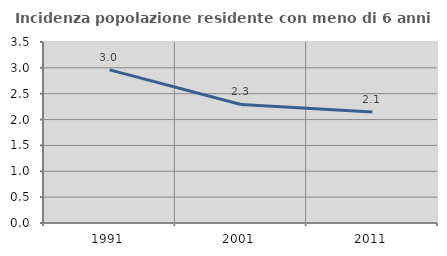
| Category | Incidenza popolazione residente con meno di 6 anni |
|---|---|
| 1991.0 | 2.96 |
| 2001.0 | 2.293 |
| 2011.0 | 2.146 |